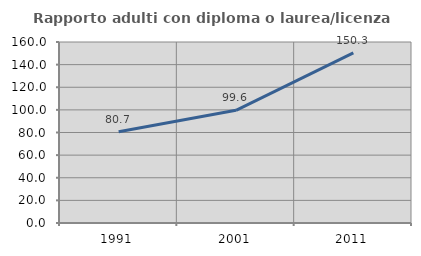
| Category | Rapporto adulti con diploma o laurea/licenza media  |
|---|---|
| 1991.0 | 80.72 |
| 2001.0 | 99.623 |
| 2011.0 | 150.331 |